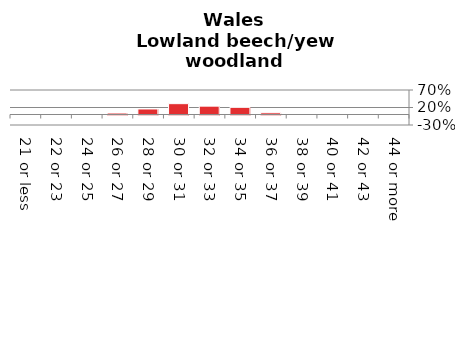
| Category | Lowland beech/yew woodland |
|---|---|
| 21 or less | 0 |
| 22 or 23 | 0 |
| 24 or 25 | 0 |
| 26 or 27 | 0.042 |
| 28 or 29 | 0.158 |
| 30 or 31 | 0.309 |
| 32 or 33 | 0.238 |
| 34 or 35 | 0.204 |
| 36 or 37 | 0.048 |
| 38 or 39 | 0 |
| 40 or 41 | 0 |
| 42 or 43 | 0 |
| 44 or more | 0 |